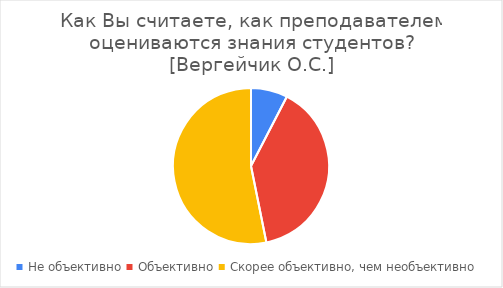
| Category | Series 0 |
|---|---|
| Не объективно | 6 |
| Объективно | 31 |
| Скорее объективно, чем необъективно | 42 |